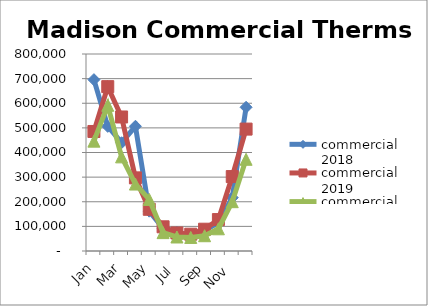
| Category | commercial 2018 | commercial 2019 | commercial 2020 |
|---|---|---|---|
| Jan | 695862 | 485378 | 446125.371 |
| Feb | 506206 | 667420 | 591588.855 |
| Mar | 439688 | 544262 | 382241.139 |
| Apr | 506429 | 296970 | 271865.687 |
| May | 161768 | 169391 | 209446.204 |
| Jun | 92454 | 98268 | 74594.021 |
| Jul | 75392 | 73297 | 56867.052 |
| Aug | 65459 | 68257 | 55062.795 |
| Sep | 83867 | 88499 | 62006.712 |
| Oct | 115547 | 127629 | 90221.506 |
| Nov | 216684 | 302258 | 200267.439 |
| Dec | 583663 | 495013 | 372412.686 |